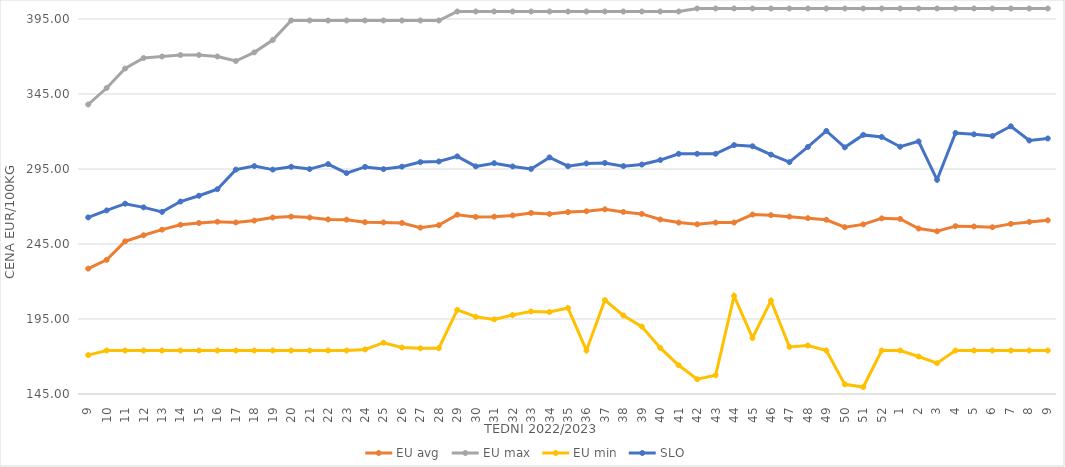
| Category | EU avg | EU max | EU min | SLO |
|---|---|---|---|---|
| 9.0 | 228.588 | 338 | 170.92 | 262.72 |
| 10.0 | 234.434 | 349 | 174 | 267.38 |
| 11.0 | 246.762 | 362 | 174 | 271.86 |
| 12.0 | 250.845 | 369 | 174 | 269.43 |
| 13.0 | 254.568 | 370 | 174 | 266.39 |
| 14.0 | 257.819 | 371 | 174 | 273.3 |
| 15.0 | 259 | 371 | 174 | 277.18 |
| 16.0 | 259.873 | 370 | 174 | 281.55 |
| 17.0 | 259.351 | 367 | 174 | 294.59 |
| 18.0 | 260.6 | 372.758 | 174 | 296.93 |
| 19.0 | 262.669 | 381 | 174 | 294.6 |
| 20.0 | 263.291 | 394 | 174 | 296.48 |
| 21.0 | 262.64 | 394 | 174 | 294.94 |
| 22.0 | 261.388 | 394 | 174 | 298.26 |
| 23.0 | 261.228 | 394 | 174 | 292.27 |
| 24.0 | 259.544 | 394 | 174.72 | 296.39 |
| 25.0 | 259.395 | 394 | 179.2 | 294.93 |
| 26.0 | 259.018 | 394 | 176 | 296.56 |
| 27.0 | 255.922 | 394 | 175.451 | 299.59 |
| 28.0 | 257.564 | 394 | 175.52 | 300.01 |
| 29.0 | 264.52 | 400 | 201.097 | 303.41 |
| 30.0 | 263.067 | 400 | 196.496 | 296.73 |
| 31.0 | 263.196 | 400 | 194.756 | 298.88 |
| 32.0 | 264.059 | 400 | 197.634 | 296.7 |
| 33.0 | 265.729 | 400 | 200.07 | 295.05 |
| 34.0 | 265.016 | 400 | 199.637 | 302.73 |
| 35.0 | 266.273 | 400 | 202.277 | 296.86 |
| 36.0 | 266.807 | 400 | 174 | 298.7 |
| 37.0 | 268.136 | 400 | 207.594 | 299.02 |
| 38.0 | 266.39 | 400 | 197.352 | 296.91 |
| 39.0 | 265.059 | 400 | 189.926 | 297.96 |
| 40.0 | 261.35 | 400 | 175.723 | 300.95 |
| 41.0 | 259.271 | 400 | 164.165 | 305.13 |
| 42.0 | 258.146 | 402 | 154.869 | 305.13 |
| 43.0 | 259.256 | 402 | 157.459 | 305.13 |
| 44.0 | 259.32 | 402 | 210.415 | 310.93 |
| 45.0 | 264.649 | 402 | 182.35 | 310.16 |
| 46.0 | 264.228 | 402 | 207.247 | 304.58 |
| 47.0 | 263.24 | 402 | 176.378 | 299.59 |
| 48.0 | 262.225 | 402 | 177.332 | 309.69 |
| 49.0 | 261.152 | 402 | 174 | 320.38 |
| 50.0 | 256.24 | 402 | 151.434 | 309.44 |
| 51.0 | 258.071 | 402 | 149.638 | 317.74 |
| 52.0 | 262.088 | 402 | 174 | 316.36 |
| 1.0 | 261.716 | 402 | 174 | 309.84 |
| 2.0 | 255.331 | 402 | 169.983 | 313.4 |
| 3.0 | 253.46 | 402 | 165.574 | 287.81 |
| 4.0 | 256.897 | 402 | 174 | 318.98 |
| 5.0 | 256.68 | 402 | 174 | 318.13 |
| 6.0 | 256.184 | 402 | 174 | 316.99 |
| 7.0 | 258.423 | 402 | 174 | 323.47 |
| 8.0 | 259.736 | 402 | 174 | 314 |
| 9.0 | 260.8 | 402 | 174 | 315.35 |